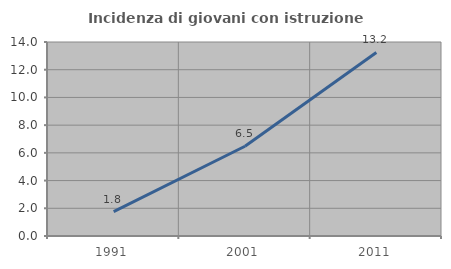
| Category | Incidenza di giovani con istruzione universitaria |
|---|---|
| 1991.0 | 1.761 |
| 2001.0 | 6.479 |
| 2011.0 | 13.245 |